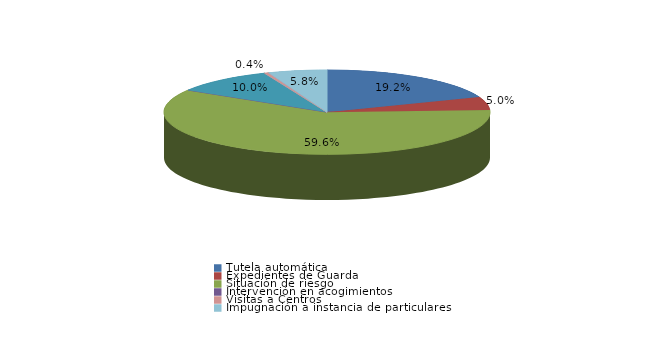
| Category | Series 0 |
|---|---|
| Tutela automática | 46 |
| Expedientes de Guarda | 12 |
| Situación de riesgo | 143 |
| Intervención en acogimientos | 0 |
| Intervención en adopciones | 24 |
| Defensa de los derechos fundamentales | 0 |
| Sustracción internacional de menores | 0 |
| Visitas a Centros | 1 |
| Ensayos Clínicos | 0 |
| Impugnación a instacia del Fiscal | 0 |
| Impugnación a instancia de particulares | 14 |